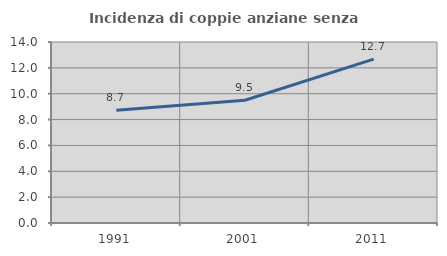
| Category | Incidenza di coppie anziane senza figli  |
|---|---|
| 1991.0 | 8.724 |
| 2001.0 | 9.493 |
| 2011.0 | 12.672 |